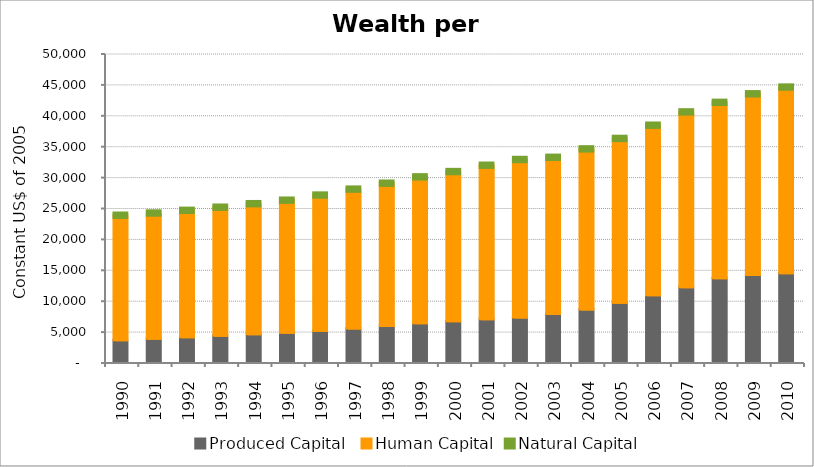
| Category | Produced Capital  | Human Capital | Natural Capital |
|---|---|---|---|
| 1990.0 | 3521.897 | 20186.875 | 15.17 |
| 1991.0 | 3747.509 | 20314.264 | 14.751 |
| 1992.0 | 3988.278 | 20510.111 | 14.366 |
| 1993.0 | 4238.487 | 20763.941 | 14.012 |
| 1994.0 | 4506.959 | 21065.72 | 13.687 |
| 1995.0 | 4735.459 | 21403.143 | 13.387 |
| 1996.0 | 5016.224 | 21952.078 | 13.11 |
| 1997.0 | 5416.513 | 22511.838 | 12.855 |
| 1998.0 | 5807.235 | 23080.174 | 12.618 |
| 1999.0 | 6267.348 | 23645.2 | 12.396 |
| 2000.0 | 6577.652 | 24192.778 | 12.185 |
| 2001.0 | 6918.952 | 24876.445 | 11.985 |
| 2002.0 | 7202.916 | 25520.067 | 11.795 |
| 2003.0 | 7760.838 | 25320.369 | 11.614 |
| 2004.0 | 8495.156 | 25946.014 | 11.442 |
| 2005.0 | 9588.279 | 26544.068 | 11.277 |
| 2006.0 | 10782.349 | 27490.896 | 11.12 |
| 2007.0 | 12098.518 | 28324.595 | 10.969 |
| 2008.0 | 13535.365 | 28436.039 | 10.823 |
| 2009.0 | 14094.739 | 29260.842 | 10.68 |
| 2010.0 | 14369.84 | 30070.545 | 10.54 |